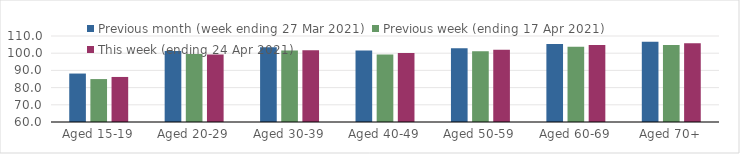
| Category | Previous month (week ending 27 Mar 2021) | Previous week (ending 17 Apr 2021) | This week (ending 24 Apr 2021) |
|---|---|---|---|
| Aged 15-19 | 88.17 | 84.96 | 86.19 |
| Aged 20-29 | 101.3 | 99.56 | 99.23 |
| Aged 30-39 | 103.51 | 101.61 | 101.76 |
| Aged 40-49 | 101.51 | 99.3 | 100.08 |
| Aged 50-59 | 102.88 | 101.07 | 102.04 |
| Aged 60-69 | 105.29 | 103.82 | 104.78 |
| Aged 70+ | 106.69 | 104.78 | 105.74 |